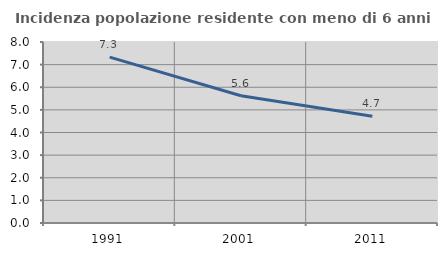
| Category | Incidenza popolazione residente con meno di 6 anni |
|---|---|
| 1991.0 | 7.332 |
| 2001.0 | 5.623 |
| 2011.0 | 4.719 |